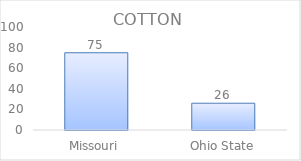
| Category | Series 0 |
|---|---|
| Missouri | 75 |
| Ohio State | 26 |